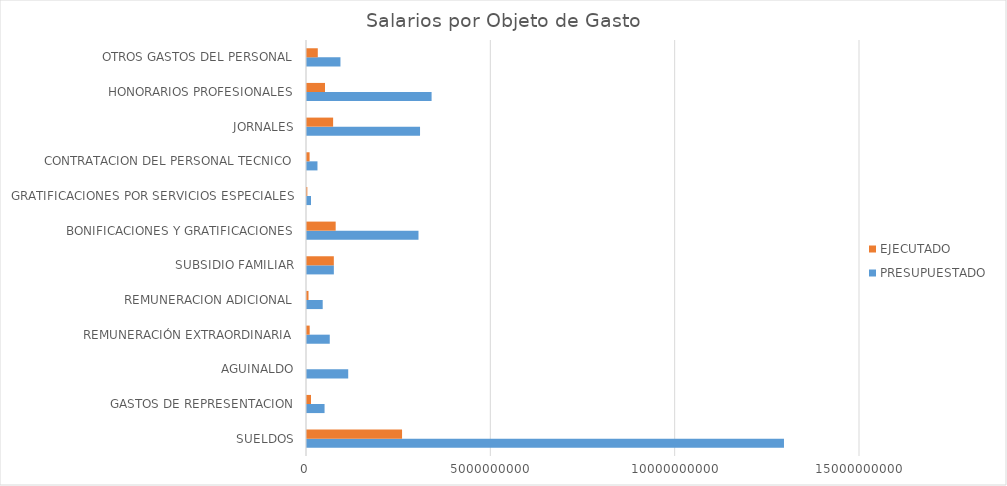
| Category | PRESUPUESTADO | EJECUTADO |
|---|---|---|
| SUELDOS | 12937973148 | 2578540524 |
| GASTOS DE REPRESENTACION | 476214000 | 107934800 |
| AGUINALDO | 1117848929 | 0 |
| REMUNERACIÓN EXTRAORDINARIA | 617333416 | 72583795 |
| REMUNERACION ADICIONAL | 425863008 | 40589199 |
| SUBSIDIO FAMILIAR | 728300000 | 727837495 |
| BONIFICACIONES Y GRATIFICACIONES | 3024010080 | 777890024 |
| GRATIFICACIONES POR SERVICIOS ESPECIALES | 108000000 | 9000000 |
| CONTRATACION DEL PERSONAL TECNICO | 284075000 | 70260642 |
| JORNALES | 3065965597 | 708546045 |
| HONORARIOS PROFESIONALES | 3379469600 | 488946274 |
| OTROS GASTOS DEL PERSONAL | 907314396 | 292702739 |